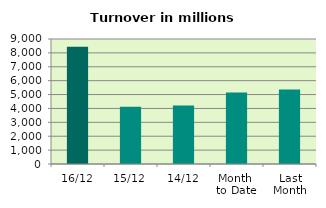
| Category | Series 0 |
|---|---|
| 16/12 | 8448.654 |
| 15/12 | 4123.458 |
| 14/12 | 4210.504 |
| Month 
to Date | 5148.394 |
| Last
Month | 5362.851 |